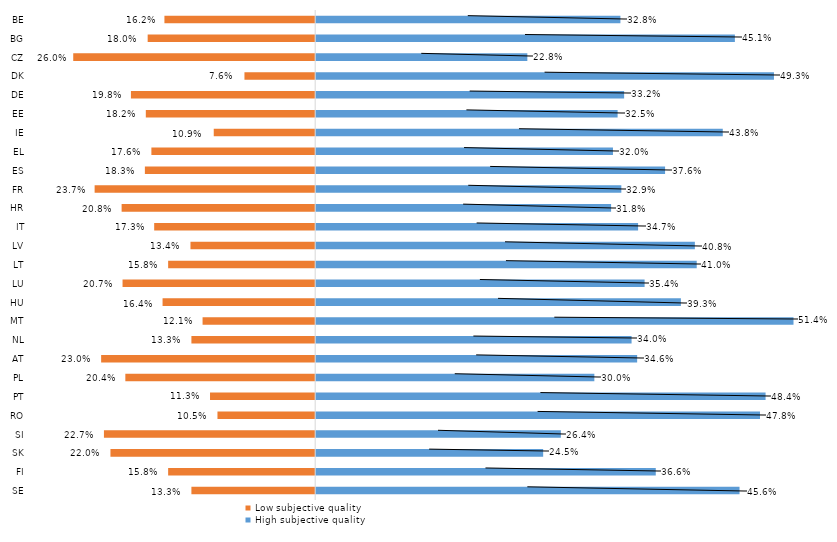
| Category | Low subjective quality | High subjective quality |
|---|---|---|
| BE | -0.162 | 0.328 |
| BG | -0.18 | 0.451 |
| CZ | -0.26 | 0.228 |
| DK | -0.076 | 0.493 |
| DE | -0.198 | 0.332 |
| EE | -0.182 | 0.325 |
| IE | -0.109 | 0.438 |
| EL | -0.176 | 0.32 |
| ES | -0.183 | 0.376 |
| FR | -0.237 | 0.329 |
| HR | -0.208 | 0.318 |
| IT | -0.173 | 0.347 |
| LV | -0.134 | 0.408 |
| LT | -0.158 | 0.41 |
| LU | -0.207 | 0.354 |
| HU | -0.164 | 0.393 |
| MT | -0.121 | 0.514 |
| NL | -0.133 | 0.34 |
| AT | -0.23 | 0.346 |
| PL | -0.204 | 0.3 |
| PT | -0.113 | 0.484 |
| RO | -0.105 | 0.478 |
| SI | -0.227 | 0.264 |
| SK | -0.22 | 0.245 |
| FI | -0.158 | 0.366 |
| SE | -0.133 | 0.456 |